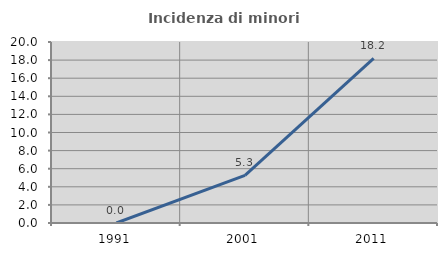
| Category | Incidenza di minori stranieri |
|---|---|
| 1991.0 | 0 |
| 2001.0 | 5.263 |
| 2011.0 | 18.182 |